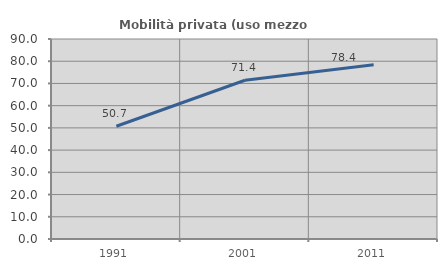
| Category | Mobilità privata (uso mezzo privato) |
|---|---|
| 1991.0 | 50.746 |
| 2001.0 | 71.429 |
| 2011.0 | 78.431 |